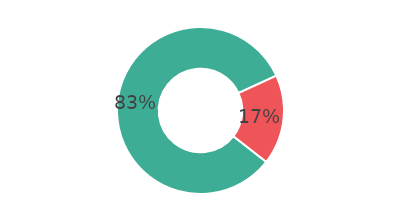
| Category | Series 0 |
|---|---|
| 0 | 82.595 |
| 1 | 17.405 |